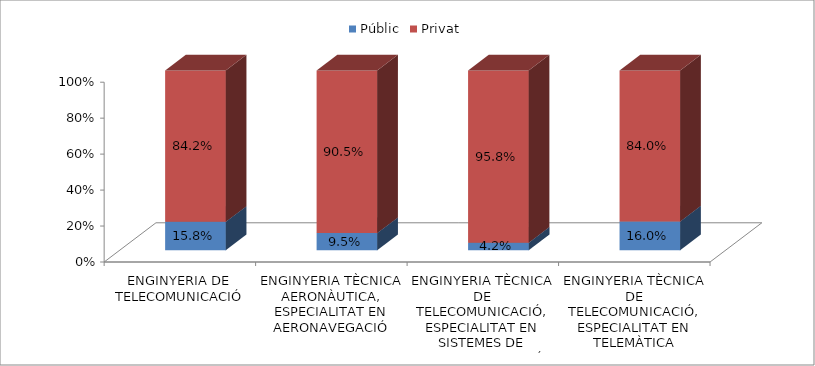
| Category | Públic | Privat |
|---|---|---|
| ENGINYERIA DE TELECOMUNICACIÓ | 0.158 | 0.842 |
| ENGINYERIA TÈCNICA AERONÀUTICA, ESPECIALITAT EN AERONAVEGACIÓ | 0.095 | 0.905 |
| ENGINYERIA TÈCNICA DE TELECOMUNICACIÓ, ESPECIALITAT EN SISTEMES DE TELECOMUNICACIÓ | 0.042 | 0.958 |
| ENGINYERIA TÈCNICA DE TELECOMUNICACIÓ, ESPECIALITAT EN TELEMÀTICA | 0.16 | 0.84 |